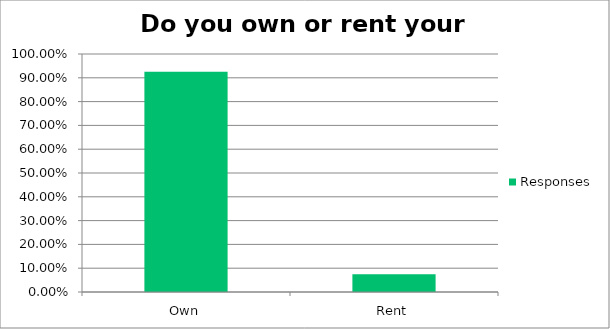
| Category | Responses |
|---|---|
| Own | 0.925 |
| Rent | 0.075 |